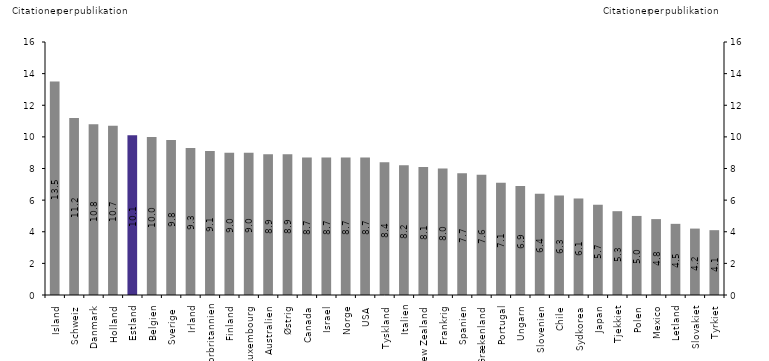
| Category | Citationer per publikation |
|---|---|
| Island | 13.5 |
| Schweiz | 11.2 |
| Danmark | 10.8 |
| Holland | 10.7 |
| Estland | 10.1 |
| Belgien | 10 |
| Sverige  | 9.8 |
| Irland | 9.3 |
| Storbritannien | 9.1 |
| Finland | 9 |
| Luxembourg | 9 |
| Australien | 8.9 |
| Østrig | 8.9 |
| Canada | 8.7 |
| Israel | 8.7 |
| Norge | 8.7 |
| USA | 8.7 |
| Tyskland | 8.4 |
| Italien | 8.2 |
| New Zealand | 8.1 |
| Frankrig | 8 |
| Spanien | 7.7 |
| Grækenland | 7.6 |
| Portugal | 7.1 |
| Ungarn | 6.9 |
| Slovenien | 6.4 |
| Chile | 6.3 |
| Sydkorea | 6.1 |
| Japan | 5.7 |
| Tjekkiet | 5.3 |
| Polen | 5 |
| Mexico | 4.8 |
| Letland | 4.5 |
| Slovakiet | 4.2 |
| Tyrkiet | 4.1 |